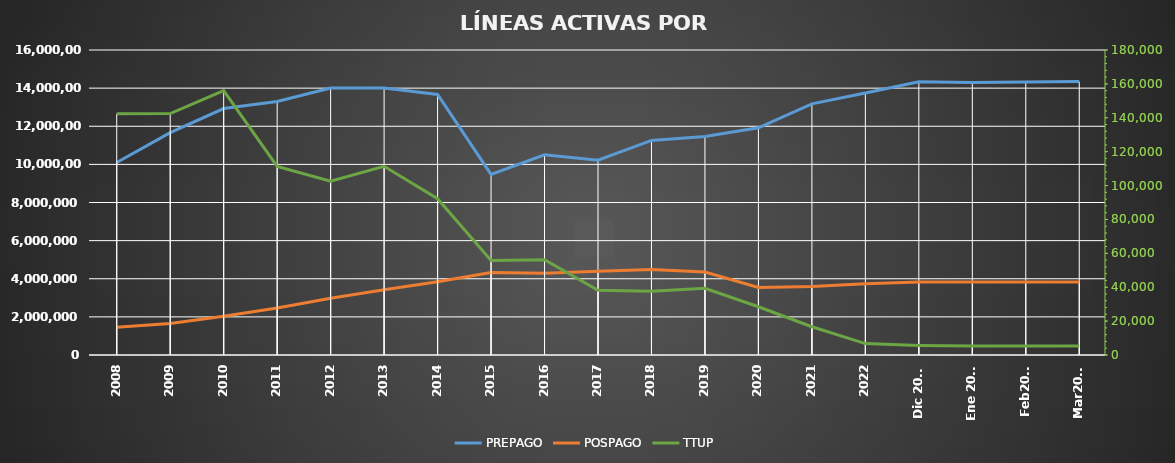
| Category | PREPAGO | POSPAGO |
|---|---|---|
| 2008 | 10097768 | 1452088 |
| 2009 | 11662294 | 1649838 |
| 2010 | 12929040 | 2033814 |
| 2011 | 13295834 | 2467378 |
| 2012 | 14008104 | 2976194 |
| 2013 | 14005126 | 3425277 |
| 2014 | 13666071 | 3846271 |
| 2015 | 9476240 | 4326937 |
| 2016 | 10498467 | 4293426 |
| 2017 | 10219457 | 4393703 |
| 2018 | 11254168 | 4480975 |
| 2019 | 11462048 | 4351686 |
| 2020 | 11917697 | 3539192 |
| 2021 | 13174530 | 3598383 |
| 2022 | 13740159 | 3743849 |
| Dic 2023 | 14330010 | 3829924 |
| Ene 2024 | 14292675 | 3831687 |
| Feb2024 | 14318625 | 3825224 |
| Mar2024 | 14343789 | 3823722 |